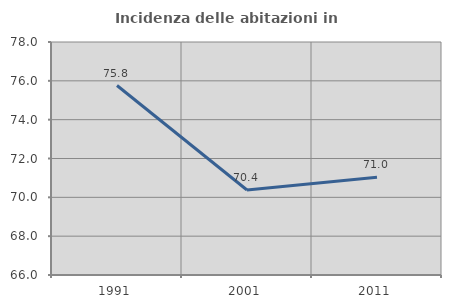
| Category | Incidenza delle abitazioni in proprietà  |
|---|---|
| 1991.0 | 75.758 |
| 2001.0 | 70.379 |
| 2011.0 | 71.036 |